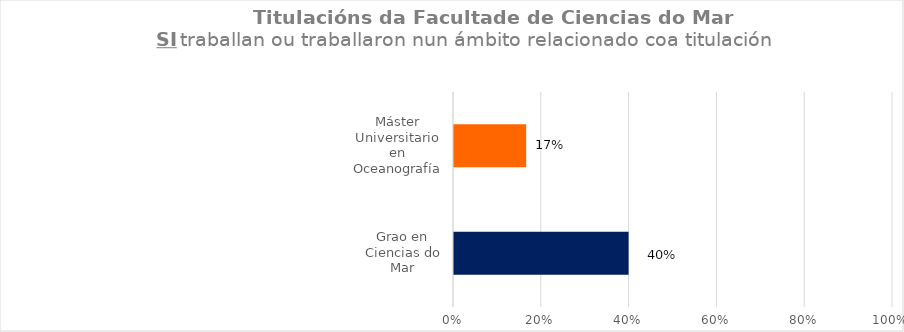
| Category | Series 1 |
|---|---|
| Grao en Ciencias do Mar | 0.4 |
| Máster Universitario en Oceanografía | 0.167 |